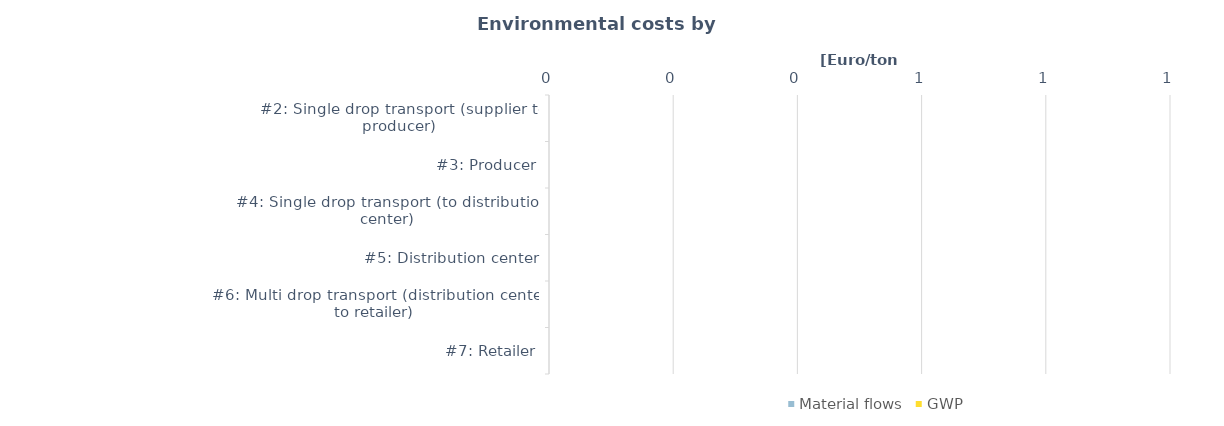
| Category | Material flows | GWP |
|---|---|---|
| #2: Single drop transport (supplier to producer) | 0 | 0 |
| #3: Producer | 0 | 0 |
| #4: Single drop transport (to distribution center) | 0 | 0 |
| #5: Distribution center | 0 | 0 |
| #6: Multi drop transport (distribution center to retailer) | 0 | 0 |
| #7: Retailer | 0 | 0 |